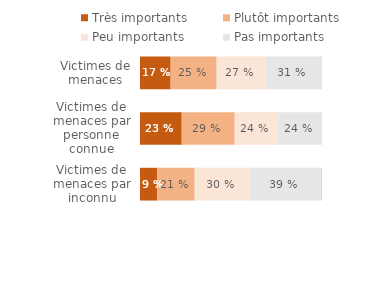
| Category | Très importants | Plutôt importants | Peu importants | Pas importants | Ne sait pas/Refus |
|---|---|---|---|---|---|
| Victimes de menaces par inconnu | 0.094 | 0.206 | 0.303 | 0.39 | 0.006 |
| Victimes de menaces par personne connue | 0.229 | 0.291 | 0.239 | 0.238 | 0.002 |
| Victimes de menaces | 0.168 | 0.253 | 0.268 | 0.307 | 0.004 |